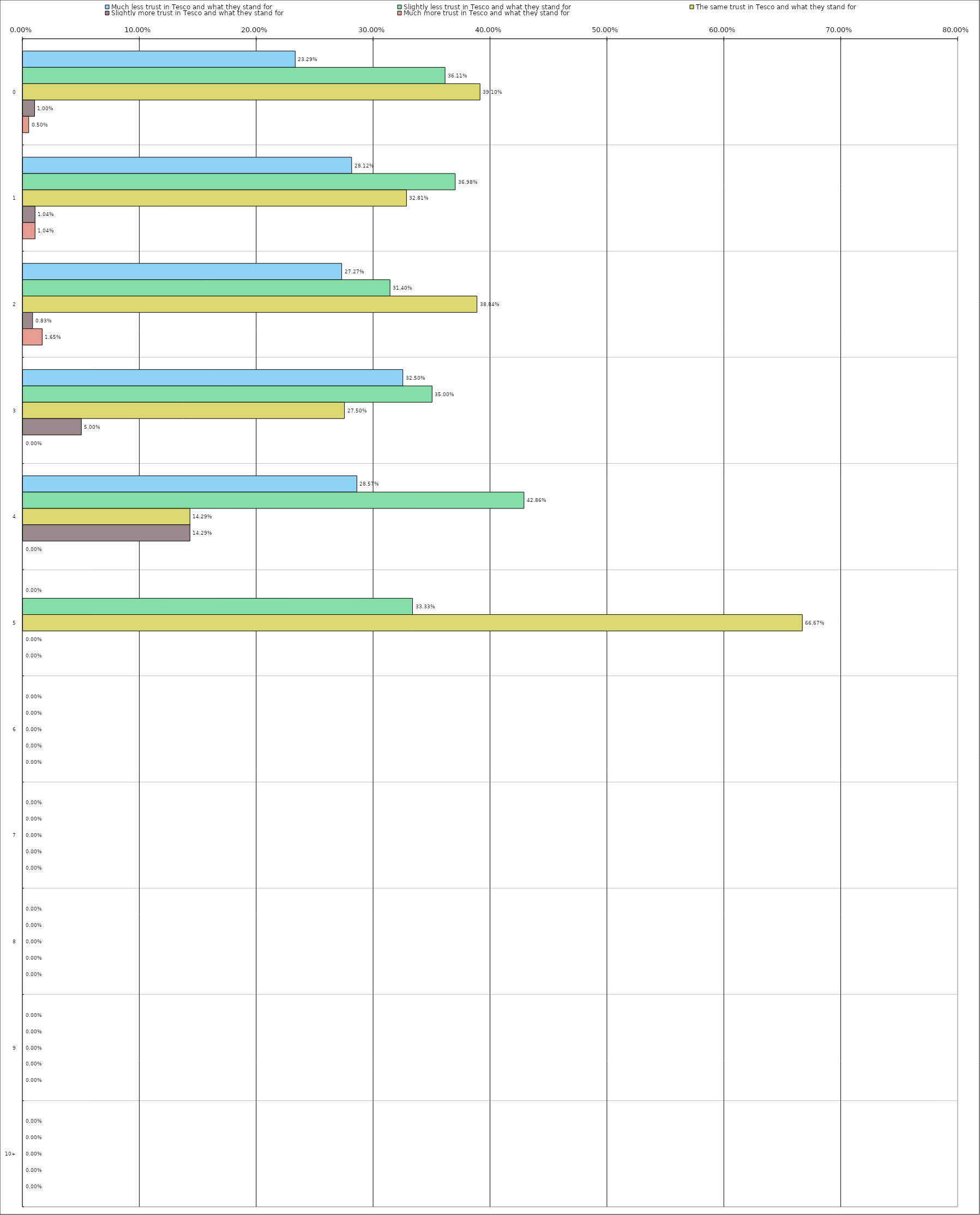
| Category | Much less trust in Tesco and what they stand for | Slightly less trust in Tesco and what they stand for | The same trust in Tesco and what they stand for | Slightly more trust in Tesco and what they stand for | Much more trust in Tesco and what they stand for |
|---|---|---|---|---|---|
| 0 | 0.233 | 0.361 | 0.391 | 0.01 | 0.005 |
| 1 | 0.281 | 0.37 | 0.328 | 0.01 | 0.01 |
| 2 | 0.273 | 0.314 | 0.388 | 0.008 | 0.016 |
| 3 | 0.325 | 0.35 | 0.275 | 0.05 | 0 |
| 4 | 0.286 | 0.429 | 0.143 | 0.143 | 0 |
| 5 | 0 | 0.333 | 0.667 | 0 | 0 |
| 6 | 0 | 0 | 0 | 0 | 0 |
| 7 | 0 | 0 | 0 | 0 | 0 |
| 8 | 0 | 0 | 0 | 0 | 0 |
| 9 | 0 | 0 | 0 | 0 | 0 |
| 10 | 0 | 0 | 0 | 0 | 0 |